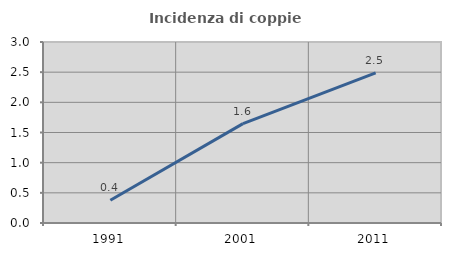
| Category | Incidenza di coppie miste |
|---|---|
| 1991.0 | 0.376 |
| 2001.0 | 1.647 |
| 2011.0 | 2.489 |